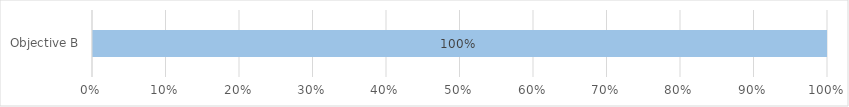
| Category | Not yet assessed | Not achieved | Partially Achieved | Achieved |
|---|---|---|---|---|
| Objective B | 1 | 0 | 0 | 0 |